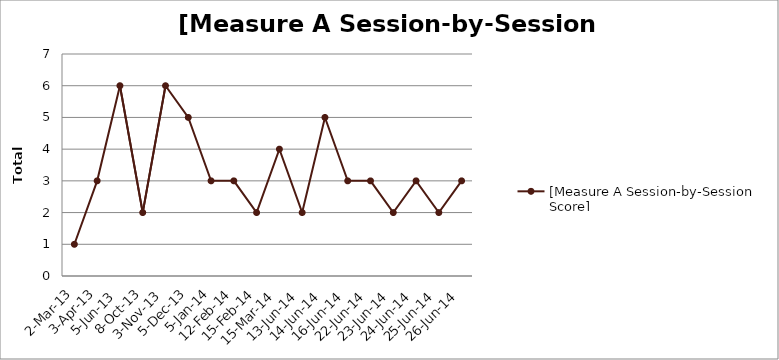
| Category | [Measure A Session-by-Session Score] |
|---|---|
| 2013-03-02 | 1 |
| 2013-04-03 | 3 |
| 2013-06-05 | 6 |
| 2013-10-08 | 2 |
| 2013-11-03 | 6 |
| 2013-12-05 | 5 |
| 2014-01-05 | 3 |
| 2014-02-12 | 3 |
| 2014-02-15 | 2 |
| 2014-03-15 | 4 |
| 2014-06-13 | 2 |
| 2014-06-14 | 5 |
| 2014-06-16 | 3 |
| 2014-06-22 | 3 |
| 2014-06-23 | 2 |
| 2014-06-24 | 3 |
| 2014-06-25 | 2 |
| 2014-06-26 | 3 |